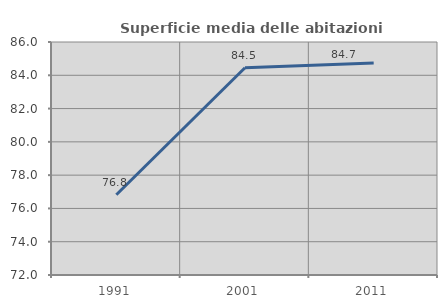
| Category | Superficie media delle abitazioni occupate |
|---|---|
| 1991.0 | 76.819 |
| 2001.0 | 84.451 |
| 2011.0 | 84.742 |